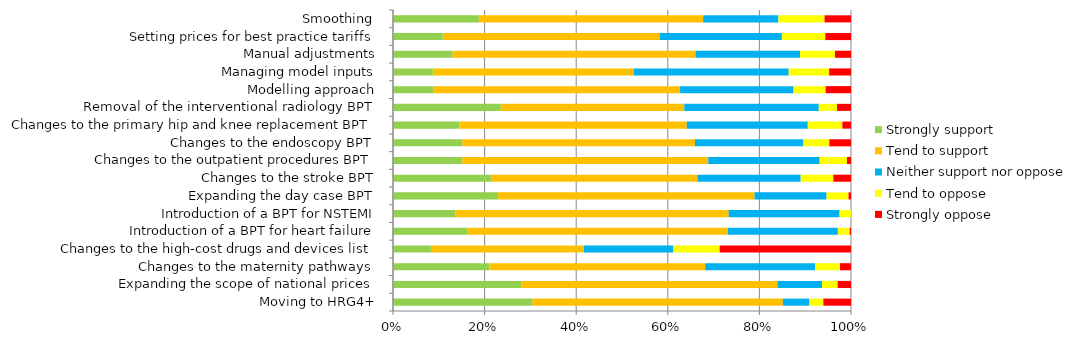
| Category | Strongly support | Tend to support | Neither support nor oppose | Tend to oppose | Strongly oppose |
|---|---|---|---|---|---|
| Moving to HRG4+ | 131 | 235 | 25 | 13 | 26 |
| Expanding the scope of national prices | 115 | 230 | 40 | 14 | 12 |
| Changes to the maternity pathways | 70 | 157 | 80 | 18 | 8 |
| Changes to the high-cost drugs and devices list | 35 | 141 | 82 | 43 | 121 |
| Introduction of a BPT for heart failure | 57 | 198 | 84 | 9 | 1 |
| Introduction of a BPT for NSTEMI | 44 | 192 | 78 | 8 | 0 |
| Expanding the day case BPT | 86 | 210 | 59 | 18 | 2 |
| Changes to the stroke BPT | 72 | 152 | 76 | 24 | 13 |
| Changes to the outpatient procedures BPT | 51 | 181 | 82 | 20 | 3 |
| Changes to the endoscopy BPT | 48 | 161 | 75 | 18 | 15 |
| Changes to the primary hip and knee replacement BPT | 46 | 158 | 84 | 24 | 6 |
| Removal of the interventional radiology BPT | 77 | 131 | 96 | 13 | 10 |
| Modelling approach | 30 | 185 | 85 | 24 | 19 |
| Managing model inputs | 24 | 119 | 92 | 24 | 13 |
| Manual adjustments | 41 | 167 | 72 | 24 | 11 |
| Setting prices for best practice tariffs | 31 | 135 | 76 | 27 | 16 |
| Smoothing  | 65 | 170 | 57 | 35 | 20 |